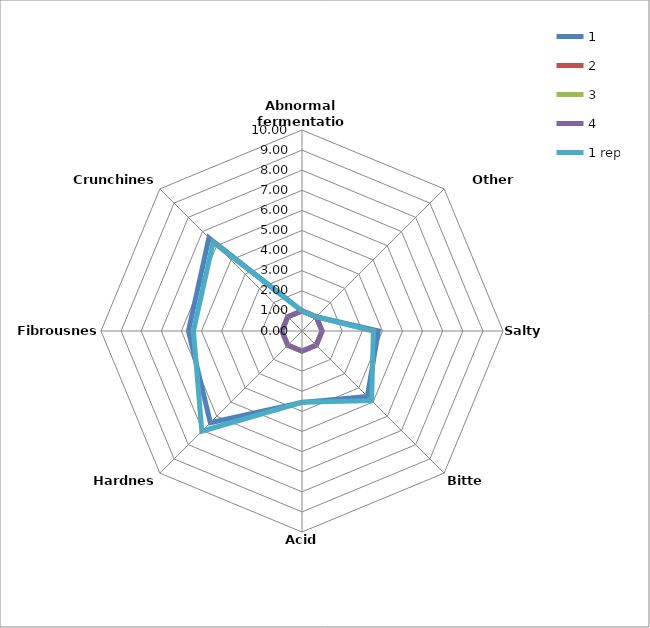
| Category | 1 | 2 | 3 | 4 | 1 rep |
|---|---|---|---|---|---|
| Abnormal fermentation | 1 | 1 | 1 | 1 | 1 |
| Other defects | 1 | 1 | 1 | 1 | 1 |
| Salty | 3.8 | 1 | 1 | 1 | 3.55 |
| Bitter | 4.6 | 1 | 1 | 1 | 4.9 |
| Acid | 3.55 | 1 | 1 | 1 | 3.55 |
| Hardness | 6.45 | 1 | 1 | 1 | 7.05 |
| Fibrousness | 5.65 | 1 | 1 | 1 | 5.4 |
| Crunchiness | 6.55 | 1 | 1 | 1 | 6.25 |